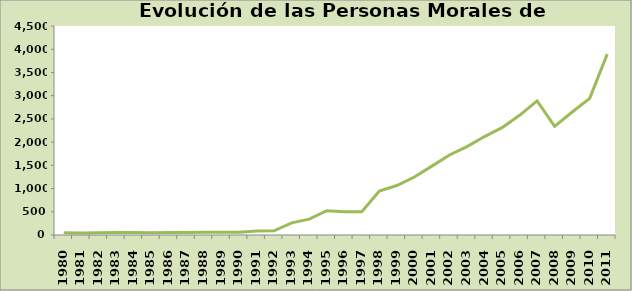
| Category | Series 0 |
|---|---|
| 1980.0 | 50 |
| 1981.0 | 44 |
| 1982.0 | 46 |
| 1983.0 | 54 |
| 1984.0 | 54 |
| 1985.0 | 51 |
| 1986.0 | 56 |
| 1987.0 | 56 |
| 1988.0 | 58 |
| 1989.0 | 60 |
| 1990.0 | 60 |
| 1991.0 | 85 |
| 1992.0 | 90 |
| 1993.0 | 261 |
| 1994.0 | 342 |
| 1995.0 | 523 |
| 1996.0 | 498 |
| 1997.0 | 503 |
| 1998.0 | 948 |
| 1999.0 | 1065 |
| 2000.0 | 1248 |
| 2001.0 | 1483 |
| 2002.0 | 1722 |
| 2003.0 | 1904 |
| 2004.0 | 2120 |
| 2005.0 | 2311 |
| 2006.0 | 2577 |
| 2007.0 | 2888 |
| 2008.0 | 2338 |
| 2009.0 | 2649 |
| 2010.0 | 2942 |
| 2011.0 | 3895 |